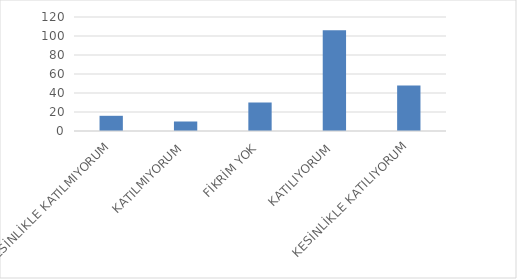
| Category | Series 0 |
|---|---|
| KESİNLİKLE KATILMIYORUM | 16 |
| KATILMIYORUM | 10 |
| FİKRİM YOK | 30 |
| KATILIYORUM | 106 |
| KESİNLİKLE KATILIYORUM | 48 |